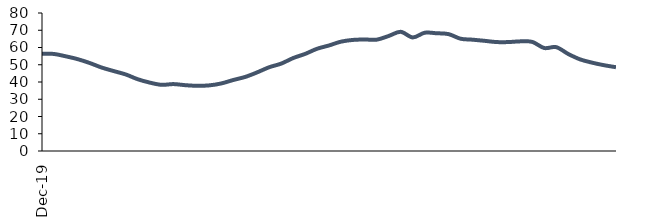
| Category | Series 0 |
|---|---|
| 2019-12-01 | 56.434 |
| 2020-01-01 | 56.256 |
| 2020-02-01 | 54.873 |
| 2020-03-01 | 53.212 |
| 2020-04-01 | 50.982 |
| 2020-05-01 | 48.355 |
| 2020-06-01 | 46.331 |
| 2020-07-01 | 44.38 |
| 2020-08-01 | 41.619 |
| 2020-09-01 | 39.667 |
| 2020-10-01 | 38.362 |
| 2020-11-01 | 38.792 |
| 2020-12-01 | 38.145 |
| 2021-01-01 | 37.796 |
| 2021-02-01 | 38.055 |
| 2021-03-01 | 39.169 |
| 2021-04-01 | 41.169 |
| 2021-05-01 | 42.952 |
| 2021-06-01 | 45.61 |
| 2021-07-01 | 48.568 |
| 2021-08-01 | 50.651 |
| 2021-09-01 | 53.87 |
| 2021-10-01 | 56.277 |
| 2021-11-01 | 59.262 |
| 2021-12-01 | 61.182 |
| 2022-01-01 | 63.387 |
| 2022-02-01 | 64.392 |
| 2022-03-01 | 64.636 |
| 2022-04-01 | 64.553 |
| 2022-05-01 | 66.706 |
| 2022-06-01 | 69.09 |
| 2022-07-01 | 65.835 |
| 2022-08-01 | 68.552 |
| 2022-09-01 | 68.253 |
| 2022-10-01 | 67.758 |
| 2022-11-01 | 65.088 |
| 2022-12-01 | 64.531 |
| 2023-01-01 | 63.88 |
| 2023-02-01 | 63.159 |
| 2023-03-01 | 63.145 |
| 2023-04-01 | 63.558 |
| 2023-05-01 | 63.246 |
| 2023-06-01 | 59.697 |
| 2023-07-01 | 60.197 |
| 2023-08-01 | 56.277 |
| 2023-09-01 | 53.115 |
| 2023-10-01 | 51.209 |
| 2023-11-01 | 49.736 |
| 2023-12-01 | 48.573 |